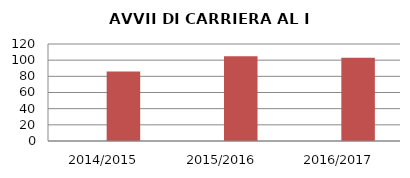
| Category | ANNO | NUMERO |
|---|---|---|
| 2014/2015 | 0 | 86 |
| 2015/2016 | 0 | 105 |
| 2016/2017 | 0 | 103 |